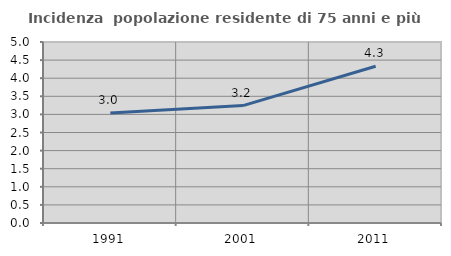
| Category | Incidenza  popolazione residente di 75 anni e più |
|---|---|
| 1991.0 | 3.041 |
| 2001.0 | 3.243 |
| 2011.0 | 4.329 |